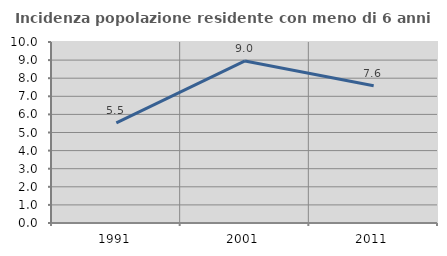
| Category | Incidenza popolazione residente con meno di 6 anni |
|---|---|
| 1991.0 | 5.532 |
| 2001.0 | 8.953 |
| 2011.0 | 7.579 |